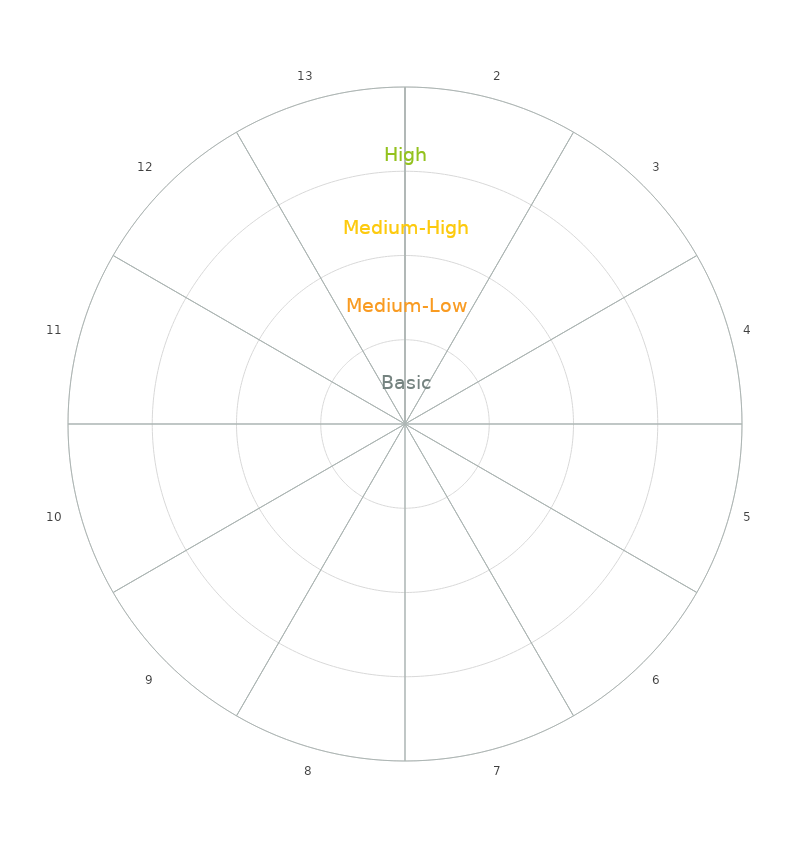
| Category | Sector Weight |
|---|---|
| KWI 0 | 0 |
| KWI 1 | 1 |
| KWI 2 | 1 |
| KWI 3 | 1 |
| KWI 4 | 1 |
| KWI 5 | 1 |
| KWI 6 | 1 |
| KWI 7 | 1 |
| KWI 8 | 1 |
| KWI 9 | 1 |
| KWI 10 | 1 |
| KWI 11 | 1 |
| KWI 12 | 1 |